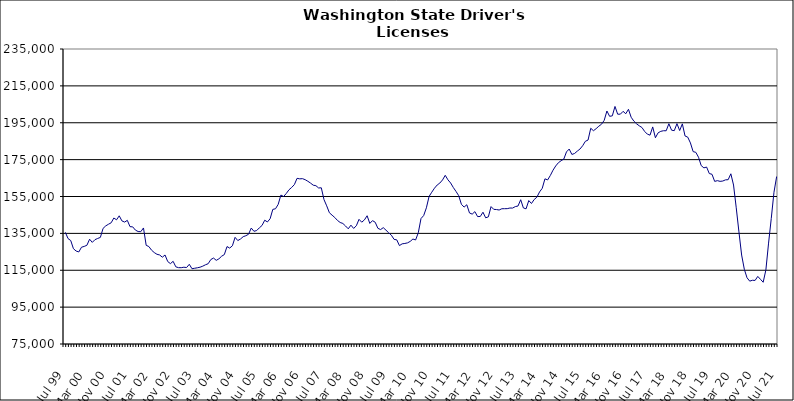
| Category | Series 0 |
|---|---|
| Jul 99 | 135560 |
| Aug 99 | 132182 |
| Sep 99 | 131104 |
| Oct 99 | 126694 |
| Nov 99 | 125425 |
| Dec 99 | 124927 |
| Jan 00 | 127499 |
| Feb 00 | 127927 |
| Mar 00 | 128547 |
| Apr 00 | 131834 |
| May 00 | 130120 |
| Jun 00 | 131595 |
| Jul 00 | 132236 |
| Aug 00 | 132819 |
| Sep 00 | 137711 |
| Oct 00 | 139063 |
| Nov 00 | 139952 |
| Dec 00 | 140732 |
| Jan 01 | 143338 |
| Feb 01 | 142359 |
| Mar 01 | 144523 |
| Apr 01 | 141758 |
| May 01 | 141135 |
| Jun 01 | 142064 |
| Jul 01 | 138646 |
| Aug 01 | 138530 |
| Sep 01 | 136784 |
| Oct 01 | 135996 |
| Nov 01 | 135917 |
| Dec 01 | 137940 |
| Jan 02 | 128531 |
| Feb 02 | 127848 |
| Mar 02 | 125876 |
| Apr 02 | 124595 |
| May 02 | 123660 |
| Jun 02 | 123282 |
| Jul 02 | 122089 |
| Aug 02 | 123279 |
| Sep 02 | 119727 |
| Oct 02 | 118588 |
| Nov 02 | 119854 |
| Dec 02 | 116851 |
| Jan 03 | 116407 |
| Feb 03 | 116382 |
| Mar 03 | 116648 |
| Apr 03 | 116471 |
| May 03 | 118231 |
| Jun 03 | 115831 |
| Jul 03 | 116082 |
| Aug 03 | 116341 |
| Sep 03 | 116653 |
| Oct 03 | 117212 |
| Nov 03 | 117962 |
| Dec 03 | 118542 |
| Jan 04 | 120817 |
| Feb 04 | 121617 |
| Mar 04 | 120369 |
| Apr 04 | 121200 |
| May 04 | 122609 |
| Jun 04 | 123484 |
| Jul 04 | 127844 |
| Aug 04 | 127025 |
| Sep 04 | 128273 |
| Oct 04 | 132853 |
| Nov 04 | 131106 |
| Dec 04 | 131935 |
| Jan 05 | 133205 |
| Feb 05 | 133736 |
| Mar 05 | 134528 |
| Apr 05 | 137889 |
| May 05 | 136130 |
| Jun 05 | 136523 |
| Jul 05 | 137997 |
| Aug 05 | 139294 |
| Sep 05 | 142140 |
| Oct 05 | 141192 |
| Nov 05 | 142937 |
| Dec 05 | 148013 |
| Jan 06 | 148341 |
| Feb 06 | 150744 |
| Mar 06 | 155794 |
| Apr 06 | 154984 |
| May 06 | 156651 |
| Jun 06 | 158638 |
| Jul 06 | 159911 |
| Aug 06 | 161445 |
| Sep 06 | 164852 |
| Oct 06 | 164570 |
| Nov 06 | 164679 |
| Dec 06 | 164127 |
| Jan 07 | 163271 |
| Feb 07 | 162273 |
| Mar 07 | 161140 |
| Apr 07 | 160860 |
| May 07 | 159633 |
| Jun 07 | 159724 |
| Jul 07 | 153303 |
| Aug 07 | 149939 |
| Sep 07 | 146172 |
| Oct 07 | 144876 |
| Nov 07 | 143613 |
| Dec 07 | 142022 |
| Jan 08 | 140909 |
| Feb 08 | 140368 |
| Mar 08 | 138998 |
| Apr 08 | 137471 |
| May 08 | 139453 |
| Jun 08 | 137680 |
| Jul 08 | 139120 |
| Aug 08 | 142612 |
| Sep-08 | 141071 |
| Oct 08 | 142313 |
| Nov 08 | 144556 |
| Dec 08 | 140394 |
| Jan 09 | 141903 |
| Feb 09 | 141036 |
| Mar 09 | 137751 |
| Apr 09 | 137060 |
| May 09 | 138101 |
| Jun 09 | 136739 |
| Jul 09 | 135317 |
| Aug 09 | 134020 |
| Sep 09 | 131756 |
| Oct 09 | 131488 |
| Nov 09 | 128370 |
| Dec 09 | 129323 |
| Jan 10 | 129531 |
| Feb 10 | 129848 |
| Mar 10 | 130654 |
| Apr 10 | 131929 |
| May 10 | 131429 |
| Jun 10 | 135357 |
| Jul 10 | 143032 |
| Aug 10 | 144686 |
| Sep 10 | 148856 |
| Oct 10 | 155042 |
| Nov 10 | 157328 |
| Dec 10 | 159501 |
| Jan 11 | 161221 |
| Feb 11 | 162312 |
| Mar 11 | 163996 |
| Apr 11 | 166495 |
| May 11 | 164040 |
| Jun 11 | 162324 |
| Jul 11 | 159862 |
| Aug 11 | 157738 |
| Sep 11 | 155430 |
| Oct 11 | 150762 |
| Nov 11 | 149255 |
| Dec 11 | 150533 |
| Jan 12 | 146068 |
| Feb 12 | 145446 |
| Mar 12 | 146788 |
| Apr 12 | 144110 |
| May 12 | 144162 |
| Jun 12 | 146482 |
| Jul 12 | 143445 |
| Aug 12 | 143950 |
| Sep 12 | 149520 |
| Oct 12 | 148033 |
| Nov 12 | 147926 |
| Dec 12 | 147674 |
| Jan 13 | 148360 |
| Feb-13 | 148388 |
| Mar-13 | 148414 |
| Apr 13 | 148749 |
| May 13 | 148735 |
| Jun-13 | 149521 |
| Jul 13 | 149837 |
| Aug 13 | 153252 |
| Sep 13 | 148803 |
| Oct 13 | 148315 |
| Nov 13 | 152804 |
| Dec 13 | 151209 |
| Jan 14 | 153357 |
| Feb-14 | 154608 |
| Mar 14 | 157479 |
| Apr 14 | 159441 |
| May 14 | 164591 |
| Jun 14 | 163995 |
| Jul-14 | 166411 |
| Aug-14 | 169272 |
| Sep 14 | 171565 |
| Oct 14 | 173335 |
| Nov 14 | 174406 |
| Dec 14 | 175302 |
| Jan 15 | 179204 |
| Feb 15 | 180737 |
| Mar 15 | 177810 |
| Apr-15 | 178331 |
| May 15 | 179601 |
| Jun-15 | 180729 |
| Jul 15 | 182540 |
| Aug 15 | 184924 |
| Sep 15 | 185620 |
| Oct 15 | 192002 |
| Nov 15 | 190681 |
| Dec 15 | 191795 |
| Jan 16 | 193132 |
| Feb 16 | 194206 |
| Mar 16 | 196319 |
| Apr 16 | 201373 |
| May 16 | 198500 |
| Jun 16 | 198743 |
| Jul 16 | 203841 |
| Aug 16 | 199630 |
| Sep 16 | 199655 |
| Oct 16 | 201181 |
| Nov 16 | 199888 |
| Dec 16 | 202304 |
| Jan 17 | 197977 |
| Feb 17 | 195889 |
| Mar 17 | 194438 |
| Apr 17 | 193335 |
| May 17 | 192430 |
| Jun 17 | 190298 |
| Jul 17 | 188832 |
| Aug 17 | 188264 |
| Sep 17 | 192738 |
| Oct 17 | 186856 |
| Nov 17 | 189537 |
| Dec 17 | 190341 |
| Jan 18 | 190670 |
| Feb 18 | 190645 |
| Mar 18 | 194476 |
| Apr 18 | 190971 |
| May 18 | 190707 |
| Jun 18 | 194516 |
| Jul 18 | 190783 |
| Aug 18 | 194390 |
| Sep 18 | 187831 |
| Oct 18 | 187188 |
| Nov 18 | 184054 |
| Dec 18 | 179347 |
| Jan 19 | 178958 |
| Feb 19 | 176289 |
| Mar 19 | 171747 |
| Apr 19 | 170532 |
| May 19 | 170967 |
| Jun 19 | 167444 |
| Jul 19 | 167059 |
| Aug 19 | 163194 |
| Sep 19 | 163599 |
| Oct 19 | 163212 |
| Nov 19 | 163388 |
| Dec 19 | 164024 |
| Jan 20 | 164114 |
| Feb 20 | 167320 |
| Mar 20 | 161221 |
| Apr 20 | 148866 |
| May 20 | 135821 |
| Jun 20 | 123252 |
| Jul 20 | 115526 |
| Aug 20 | 110940 |
| Sep 20 | 109099 |
| Oct 20 | 109566 |
| Nov 20 | 109488 |
| Dec 20 | 111658 |
| Jan 21 | 110070 |
| Feb 21 | 108491 |
| Mar 21 | 115176 |
| Apr 21 | 129726 |
| May 21 | 143052 |
| Jun 21 | 157253 |
| Jul 21 | 165832 |